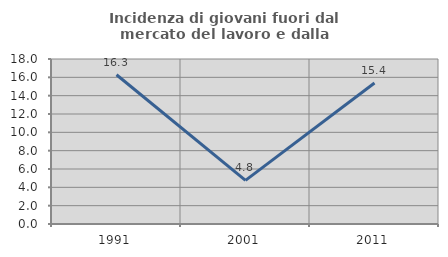
| Category | Incidenza di giovani fuori dal mercato del lavoro e dalla formazione  |
|---|---|
| 1991.0 | 16.279 |
| 2001.0 | 4.762 |
| 2011.0 | 15.385 |